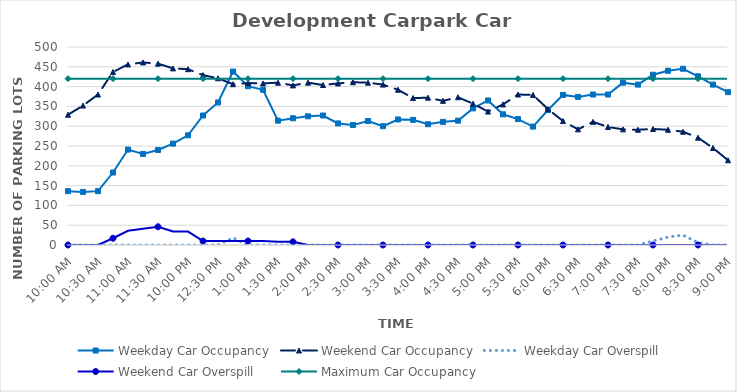
| Category | Weekday Car Occupancy | Weekend Car Occupancy | Weekday Car Overspill | Weekend Car Overspill | Maximum Car Occupancy |
|---|---|---|---|---|---|
| 0.4166666666666667 | 136 | 329 | 0 | 0 | 420 |
| 0.4270833333333333 | 134 | 352 | 0 | 0 | 420 |
| 0.4375 | 136 | 380 | 0 | 0 | 420 |
| 0.4479166666666667 | 183 | 437 | 0 | 17 | 420 |
| 0.4583333333333333 | 241 | 456 | 0 | 36 | 420 |
| 0.46875 | 230 | 461 | 0 | 41 | 420 |
| 0.4791666666666667 | 240 | 458 | 0 | 46 | 420 |
| 0.4895833333333333 | 256 | 446 | 0 | 34 | 420 |
| 0.5 | 277 | 444 | 0 | 34 | 420 |
| 0.5104166666666666 | 327 | 429 | 0 | 10 | 420 |
| 0.5208333333333334 | 360 | 421 | 0 | 10 | 420 |
| 0.53125 | 438 | 406 | 18 | 10 | 420 |
| 0.5416666666666666 | 401 | 409 | 0 | 10 | 420 |
| 0.5520833333333334 | 392 | 408 | 0 | 10 | 420 |
| 0.5625 | 314 | 410 | 0 | 8 | 420 |
| 0.5729166666666666 | 320 | 403 | 0 | 8 | 420 |
| 0.5833333333333334 | 325 | 410 | 0 | 0 | 420 |
| 0.59375 | 327 | 404 | 0 | 0 | 420 |
| 0.604166666666667 | 307 | 408 | 0 | 0 | 420 |
| 0.614583333333334 | 303 | 411 | 0 | 0 | 420 |
| 0.625 | 313 | 410 | 0 | 0 | 420 |
| 0.635416666666667 | 300 | 405 | 0 | 0 | 420 |
| 0.645833333333334 | 317 | 392 | 0 | 0 | 420 |
| 0.656250000000001 | 316 | 371 | 0 | 0 | 420 |
| 0.666666666666667 | 305 | 372 | 0 | 0 | 420 |
| 0.677083333333334 | 311 | 364 | 0 | 0 | 420 |
| 0.687500000000001 | 314 | 373 | 0 | 0 | 420 |
| 0.697916666666668 | 345 | 357 | 0 | 0 | 420 |
| 0.708333333333335 | 365 | 337 | 0 | 0 | 420 |
| 0.718750000000002 | 330 | 355 | 0 | 0 | 420 |
| 0.729166666666669 | 318 | 380 | 0 | 0 | 420 |
| 0.739583333333336 | 299 | 379 | 0 | 0 | 420 |
| 0.75 | 341 | 343 | 0 | 0 | 420 |
| 0.7604166666666666 | 379 | 313 | 0 | 0 | 420 |
| 0.7708333333333334 | 374 | 292 | 0 | 0 | 420 |
| 0.78125 | 380 | 311 | 0 | 0 | 420 |
| 0.7916666666666666 | 380 | 298 | 0 | 0 | 420 |
| 0.8020833333333334 | 410 | 292 | 0 | 0 | 420 |
| 0.8125 | 405 | 291 | 0 | 0 | 420 |
| 0.8229166666666666 | 430 | 293 | 10 | 0 | 420 |
| 0.8333333333333334 | 440 | 291 | 20 | 0 | 420 |
| 0.84375 | 445 | 286 | 25 | 0 | 420 |
| 0.8541666666666666 | 426 | 271 | 6 | 0 | 420 |
| 0.8645833333333334 | 405 | 245 | 0 | 0 | 420 |
| 0.875 | 386 | 214 | 0 | 0 | 420 |